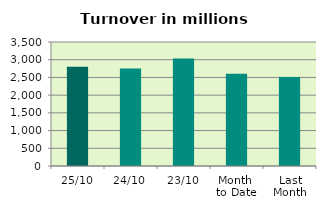
| Category | Series 0 |
|---|---|
| 25/10 | 2798.178 |
| 24/10 | 2754.277 |
| 23/10 | 3032.506 |
| Month 
to Date | 2600.471 |
| Last
Month | 2513.15 |